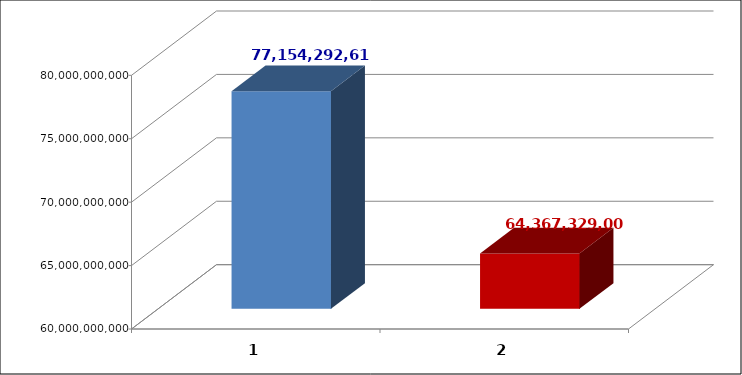
| Category | Series 0 |
|---|---|
| 0 | 77154292613.53 |
| 1 | 64367329005 |